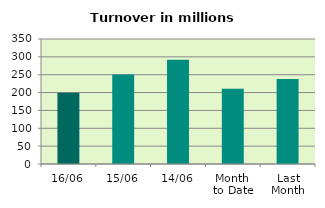
| Category | Series 0 |
|---|---|
| 16/06 | 199.698 |
| 15/06 | 250.897 |
| 14/06 | 292.098 |
| Month 
to Date | 210.364 |
| Last
Month | 237.894 |